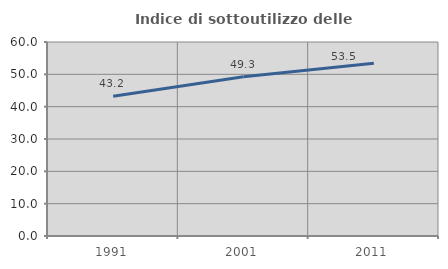
| Category | Indice di sottoutilizzo delle abitazioni  |
|---|---|
| 1991.0 | 43.2 |
| 2001.0 | 49.275 |
| 2011.0 | 53.459 |